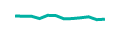
| Category | Series 1 |
|---|---|
| 0 | 532 |
| 1 | 511 |
| 2 | 514 |
| 3 | 391 |
| 4 | 561 |
| 5 | 546 |
| 6 | 375 |
| 7 | 391 |
| 8 | 431 |
| 9 | 483 |
| 10 | 333 |
| 11 | 358 |